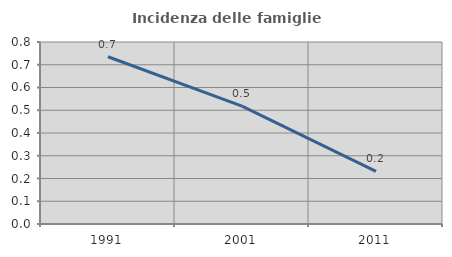
| Category | Incidenza delle famiglie numerose |
|---|---|
| 1991.0 | 0.735 |
| 2001.0 | 0.518 |
| 2011.0 | 0.231 |